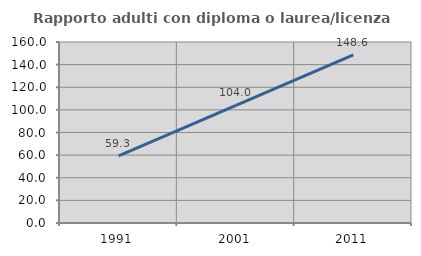
| Category | Rapporto adulti con diploma o laurea/licenza media  |
|---|---|
| 1991.0 | 59.3 |
| 2001.0 | 104.019 |
| 2011.0 | 148.576 |